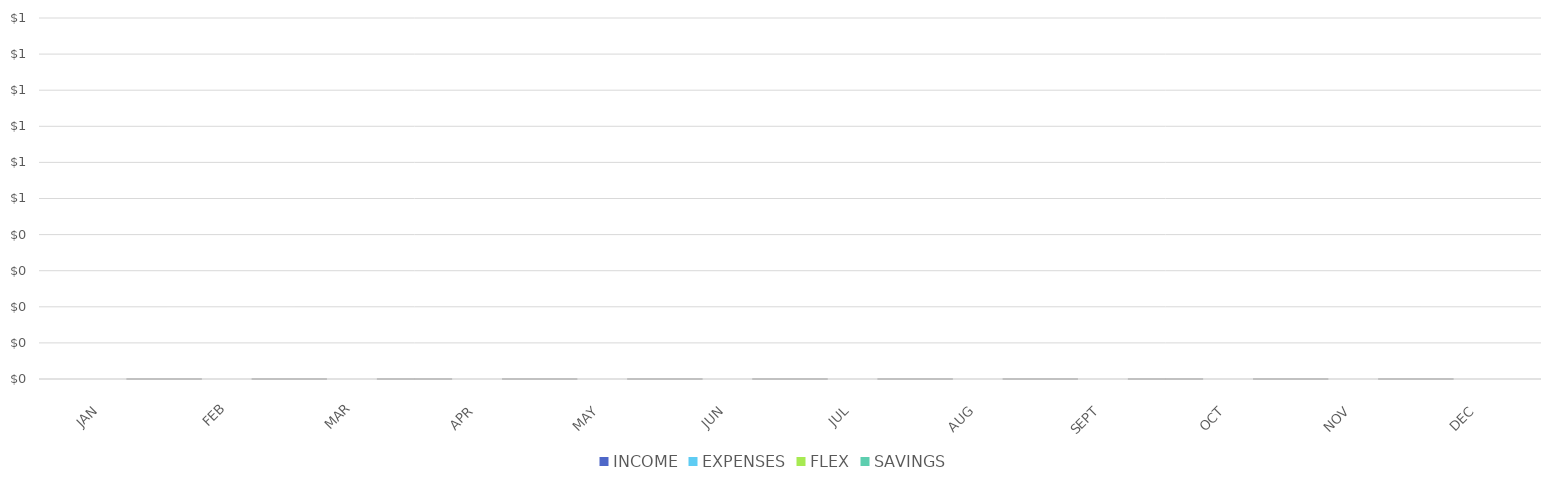
| Category | INCOME | EXPENSES | FLEX | SAVINGS |
|---|---|---|---|---|
| JAN | 0 | 0 | 0 | 0 |
| FEB | 0 | 0 | 0 | 0 |
| MAR | 0 | 0 | 0 | 0 |
| APR | 0 | 0 | 0 | 0 |
| MAY | 0 | 0 | 0 | 0 |
| JUN | 0 | 0 | 0 | 0 |
| JUL | 0 | 0 | 0 | 0 |
| AUG | 0 | 0 | 0 | 0 |
| SEPT | 0 | 0 | 0 | 0 |
| OCT | 0 | 0 | 0 | 0 |
| NOV | 0 | 0 | 0 | 0 |
| DEC | 0 | 0 | 0 | 0 |